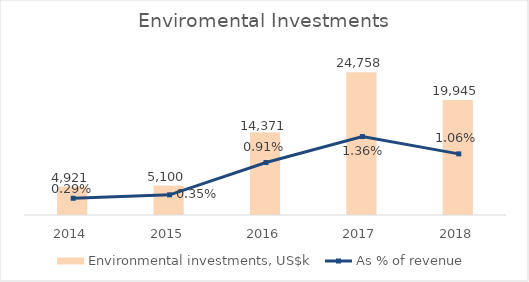
| Category | Environmental investments, US$k |
|---|---|
| 2014.0 | 4921 |
| 2015.0 | 5100 |
| 2016.0 | 14371 |
| 2017.0 | 24758 |
| 2018.0 | 19945 |